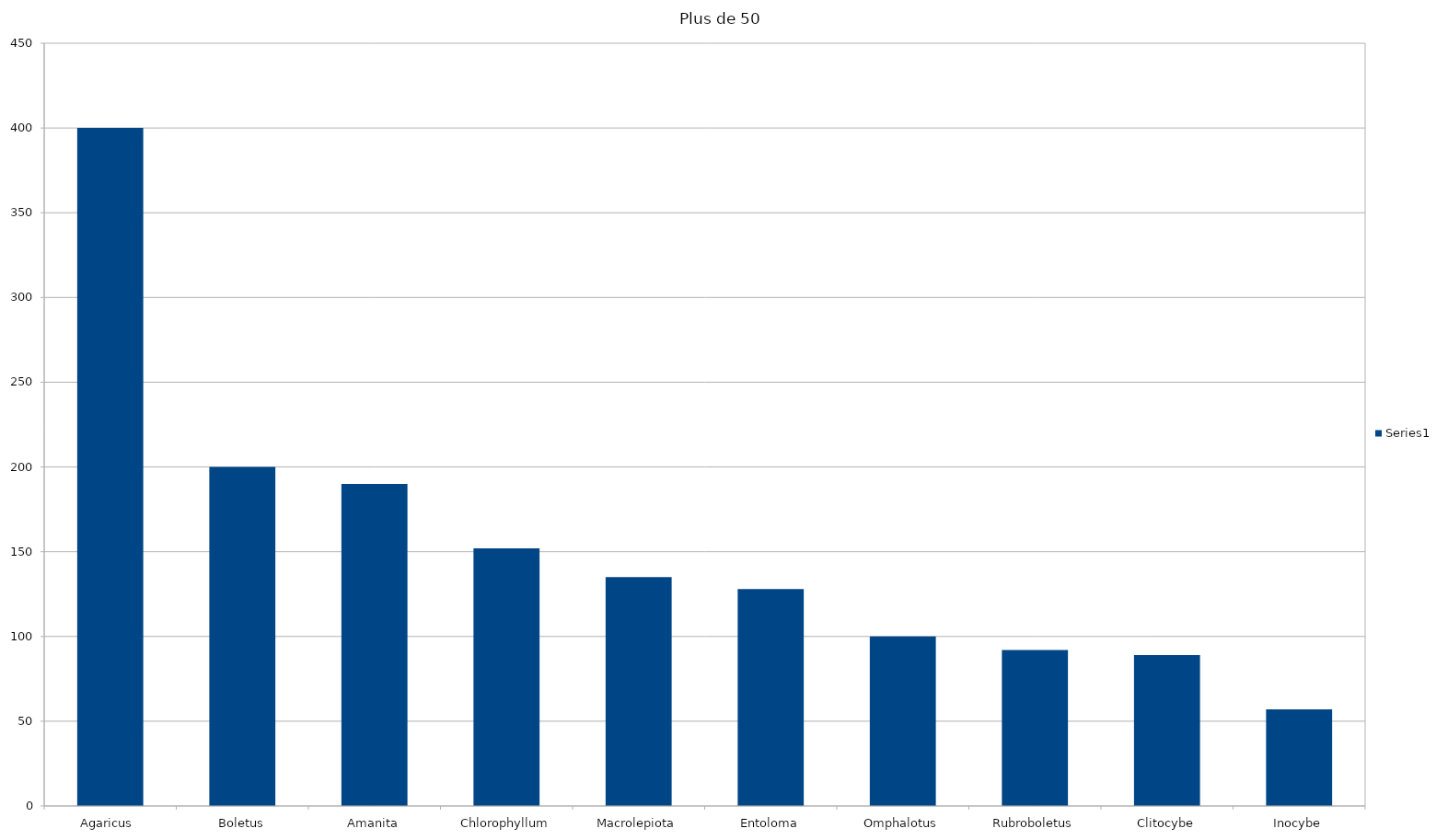
| Category | Series 0 |
|---|---|
| Agaricus  | 400 |
| Boletus | 200 |
| Amanita | 190 |
| Chlorophyllum | 152 |
| Macrolepiota | 135 |
| Entoloma | 128 |
| Omphalotus | 100 |
| Rubroboletus | 92 |
| Clitocybe | 89 |
| Inocybe | 57 |